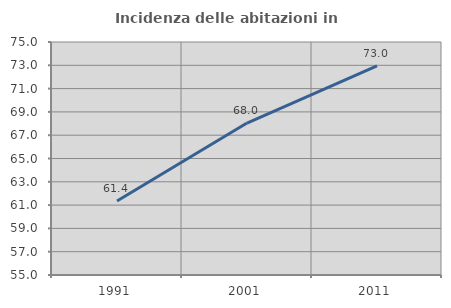
| Category | Incidenza delle abitazioni in proprietà  |
|---|---|
| 1991.0 | 61.357 |
| 2001.0 | 68.043 |
| 2011.0 | 72.957 |